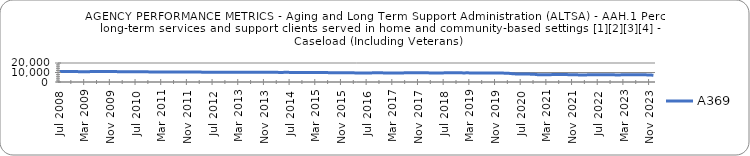
| Category | A369 |
|---|---|
| 0.79632 | 10997 |
| 0.79721 | 10998 |
| 0.79865 | 11012 |
| 0.79917 | 10952 |
| 0.79965 | 10982 |
| 0.79991 | 11004 |
| 0.80036 | 10888 |
| 0.80119 | 10875 |
| 0.80135 | 10888 |
| 0.80196 | 10907 |
| 0.80282 | 10935 |
| 0.80375 | 10958 |
| 0.80441 | 11000 |
| 0.80454 | 11047 |
| 0.80574 | 11055 |
| 0.80717 | 11068 |
| 0.80907 | 11027 |
| 0.80996 | 10989 |
| 0.81048 | 10912 |
| 0.81132 | 10912 |
| 0.81235 | 10917 |
| 0.81422 | 10847 |
| 0.81521 | 10791 |
| 0.81511 | 10781 |
| 0.816 | 10811 |
| 0.81562 | 10791 |
| 0.8177 | 10770 |
| 0.81902 | 10702 |
| 0.81999 | 10634 |
| 0.8202 | 10642 |
| 0.82092 | 10586 |
| 0.82336 | 10569 |
| 0.82379 | 10551 |
| 0.82545 | 10503 |
| 0.82578 | 10492 |
| 0.82632 | 10488 |
| 0.82543 | 10474.385 |
| 0.82484 | 10428.753 |
| 0.82636 | 10427.333 |
| 0.82733 | 10427.299 |
| 0.82838 | 10397.339 |
| 0.82888 | 10439.998 |
| 0.82809 | 10399.738 |
| 0.82917 | 10429.44 |
| 0.82866 | 10399.851 |
| 0.82858 | 10351.753 |
| 0.82802 | 10315.966 |
| 0.82938 | 10298.589 |
| 0.83046 | 10347.685 |
| 0.83086 | 10356.065 |
| 0.83171 | 10322.2 |
| 0.83162 | 10383 |
| 0.83156 | 10391 |
| 0.8309 | 10301 |
| 0.83222 | 10240.994 |
| 0.83276 | 10179.564 |
| 0.83338 | 10150.03 |
| 0.83336 | 10179 |
| 0.83239 | 10224 |
| 0.83251 | 10265 |
| 0.8337 | 10204 |
| 0.83426 | 10199 |
| 0.83557 | 10162.788 |
| 0.83627 | 10211.46 |
| 0.83614 | 10282.5 |
| 0.83597 | 10283.76 |
| 0.83796 | 10225 |
| 0.83821 | 10162 |
| 0.83855 | 10132.789 |
| 0.84014 | 10097 |
| 0.83995 | 10142 |
| 0.84007 | 10168 |
| 0.8402 | 10089 |
| 0.841 | 10072 |
| 0.8424 | 10088 |
| 0.8431 | 10041 |
| 0.8435 | 10037 |
| 0.8439 | 10066 |
| 0.84383 | 9965 |
| 0.84463 | 9913 |
| 0.84443 | 9922 |
| 0.84487 | 9933 |
| 0.84543 | 9937 |
| 0.8466 | 9924 |
| 0.84682 | 9834 |
| 0.84816 | 9811 |
| 0.84589 | 9826 |
| 0.84646 | 9855 |
| 0.84772 | 9818 |
| 0.8486 | 9753 |
| 0.84786 | 9696 |
| 0.84849 | 9653 |
| 0.84851 | 9597 |
| 0.8492 | 9581 |
| 0.84852 | 9524 |
| 0.84989 | 9502 |
| 0.85076 | 9565 |
| 0.85196 | 9587 |
| 0.8534 | 9632 |
| 0.85355 | 9620 |
| 0.85326 | 9683 |
| 0.85294 | 9579 |
| 0.85119 | 9533 |
| 0.85152 | 9427 |
| 0.85143 | 9437 |
| 0.85182 | 9420 |
| 0.8521 | 9485 |
| 0.85264 | 9549 |
| 0.85441 | 9762.677 |
| 0.85526 | 9795.097 |
| 0.85728 | 9802.8 |
| 0.8577 | 9820.29 |
| 0.85845 | 9813.6 |
| 0.85828 | 9775.452 |
| 0.85799 | 9659.065 |
| 0.85772 | 9603.25 |
| 0.85887 | 9536.968 |
| 0.86116 | 9520.667 |
| 0.86123 | 9513.226 |
| 0.86193 | 9541.433 |
| 0.86372 | 9629.452 |
| 0.86147 | 9696.548 |
| 0.86303 | 9703.567 |
| 0.86431 | 9642.226 |
| 0.86533 | 9616.567 |
| 0.86473 | 9623.419 |
| 0.86411 | 9585.871 |
| 0.86504 | 9622.893 |
| 0.86518 | 9582.677 |
| 0.86641 | 9528.267 |
| 0.86717 | 9501.839 |
| 0.86792 | 9536.333 |
| 0.8694 | 9478.871 |
| 0.86921 | 9460.097 |
| 0.87375 | 9486.2 |
| 0.87927 | 9457.258 |
| 0.88196 | 9416.967 |
| 0.8826 | 9366.613 |
| 0.88378 | 9348.71 |
| 0.88511 | 9328 |
| 0.8857 | 9127.871 |
| 0.88923 | 8731.533 |
| 0.89424 | 8527.29 |
| 0.89466 | 8531 |
| 0.89512 | 8441.645 |
| 0.89475 | 8344.548 |
| 0.89525 | 8319.167 |
| 0.89485 | 8259.839 |
| 0.89346 | 8067.233 |
| 0.89386 | 7659.871 |
| 0.89048 | 7580.677 |
| 0.89013 | 7640.786 |
| 0.89185 | 7686.613 |
| 0.8934 | 7733.5 |
| 0.89298 | 7847.29 |
| 0.89372 | 7867.2 |
| 0.89661 | 7911.677 |
| 0.89824 | 7940.645 |
| 0.89708 | 7794.067 |
| 0.89662 | 7677.645 |
| 0.89759 | 7677.7 |
| 0.89814 | 7623.645 |
| 0.89823 | 7374.935 |
| 0.89819 | 7289.036 |
| 0.89789 | 7472.226 |
| 0.89829 | 7556.4 |
| 0.89874 | 7516.516 |
| 0.90061 | 7504.833 |
| 0.90125 | 7520.742 |
| 0.90115 | 7577.548 |
| 0.90196 | 7618.1 |
| 0.90133 | 7616.452 |
| 0.90135 | 7601.833 |
| 0.90118 | 7495.226 |
| 0.90219 | 7476.129 |
| 0.90296 | 7501.786 |
| 0.90356 | 7559.935 |
| 0.90607 | 7612.167 |
| 0.90755 | 7688.71 |
| 0.91023 | 7718.533 |
| nan | 7653.871 |
| nan | 7654.194 |
| nan | 7611.3 |
| nan | 7480.452 |
| nan | 7354.067 |
| nan | 7127.323 |